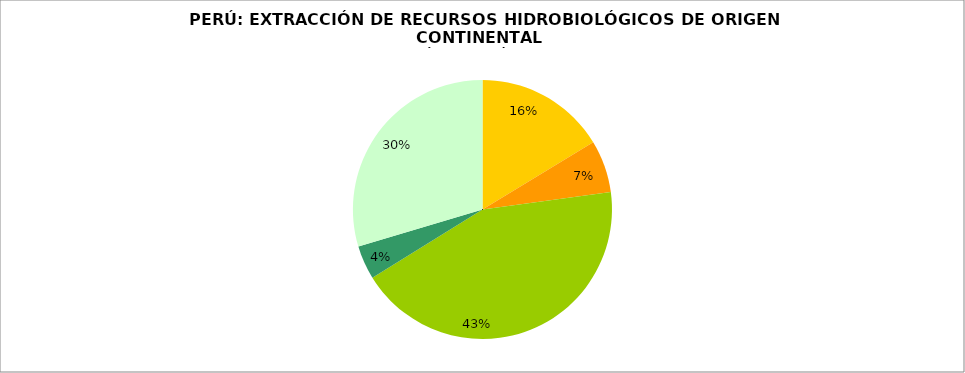
| Category | Series 0 |
|---|---|
| Loreto | 12343.697 |
| Ucayali | 4953.51 |
| Puno | 32780.998 |
| Junín | 3198 |
| Otros | 22399.612 |